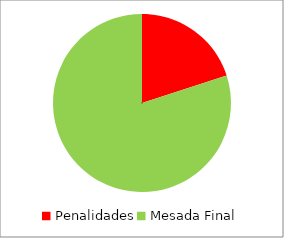
| Category | Series 0 |
|---|---|
| Penalidades | -20 |
| Mesada Final | 80 |